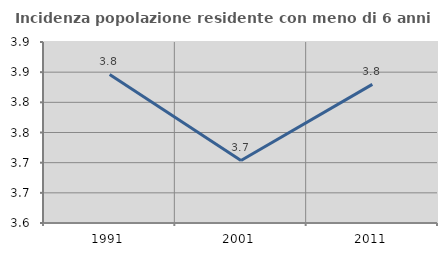
| Category | Incidenza popolazione residente con meno di 6 anni |
|---|---|
| 1991.0 | 3.846 |
| 2001.0 | 3.704 |
| 2011.0 | 3.83 |